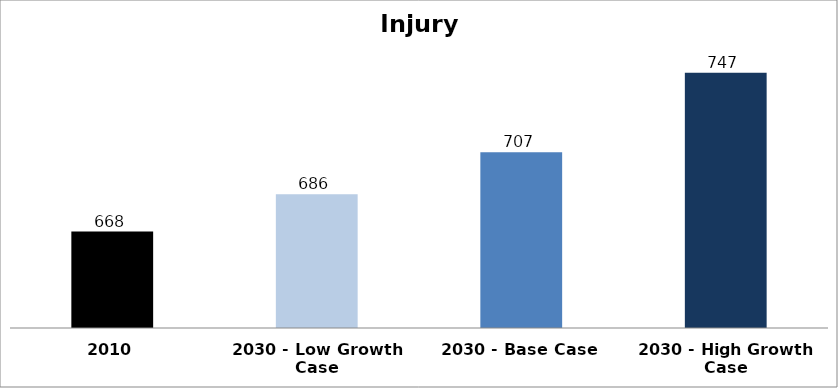
| Category | Injury Rate |
|---|---|
| 2010 | 667.85 |
| 2030 - Low Growth Case | 686.429 |
| 2030 - Base Case | 707.3 |
| 2030 - High Growth Case | 746.75 |